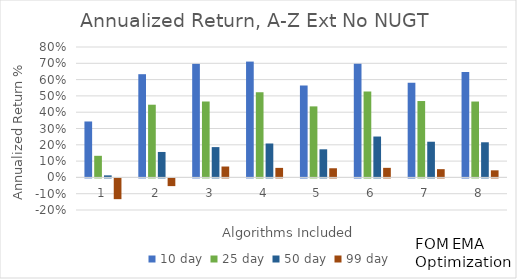
| Category | 10 day | 25 day | 50 day | 99 day |
|---|---|---|---|---|
| 1.0 | 0.343 | 0.132 | 0.013 | -0.127 |
| 2.0 | 0.633 | 0.446 | 0.156 | -0.047 |
| 3.0 | 0.697 | 0.466 | 0.186 | 0.067 |
| 4.0 | 0.711 | 0.522 | 0.208 | 0.058 |
| 5.0 | 0.564 | 0.436 | 0.172 | 0.056 |
| 6.0 | 0.697 | 0.527 | 0.251 | 0.059 |
| 7.0 | 0.581 | 0.469 | 0.219 | 0.051 |
| 8.0 | 0.646 | 0.465 | 0.215 | 0.043 |